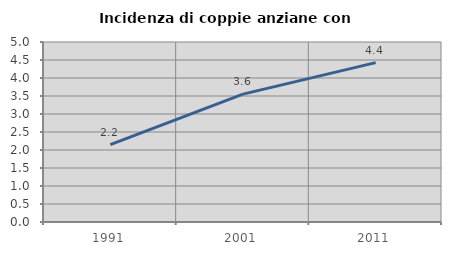
| Category | Incidenza di coppie anziane con figli |
|---|---|
| 1991.0 | 2.151 |
| 2001.0 | 3.552 |
| 2011.0 | 4.428 |